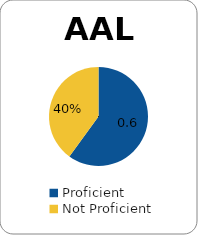
| Category | Series 0 |
|---|---|
| Proficient | 0.6 |
| Not Proficient | 0.4 |